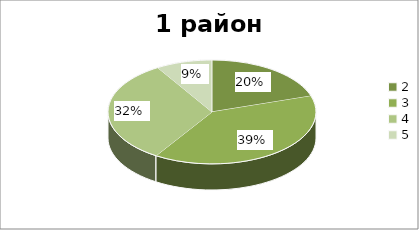
| Category | Series 0 |
|---|---|
| 2.0 | 0.201 |
| 3.0 | 0.39 |
| 4.0 | 0.322 |
| 5.0 | 0.087 |